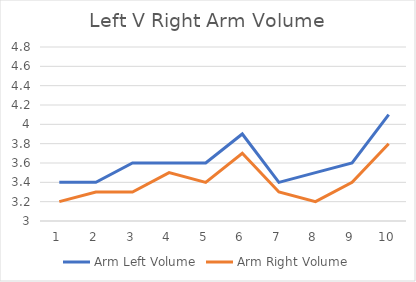
| Category | Arm Left Volume | Arm Right Volume |
|---|---|---|
| 0 | 3.4 | 3.2 |
| 1 | 3.4 | 3.3 |
| 2 | 3.6 | 3.3 |
| 3 | 3.6 | 3.5 |
| 4 | 3.6 | 3.4 |
| 5 | 3.9 | 3.7 |
| 6 | 3.4 | 3.3 |
| 7 | 3.5 | 3.2 |
| 8 | 3.6 | 3.4 |
| 9 | 4.1 | 3.8 |